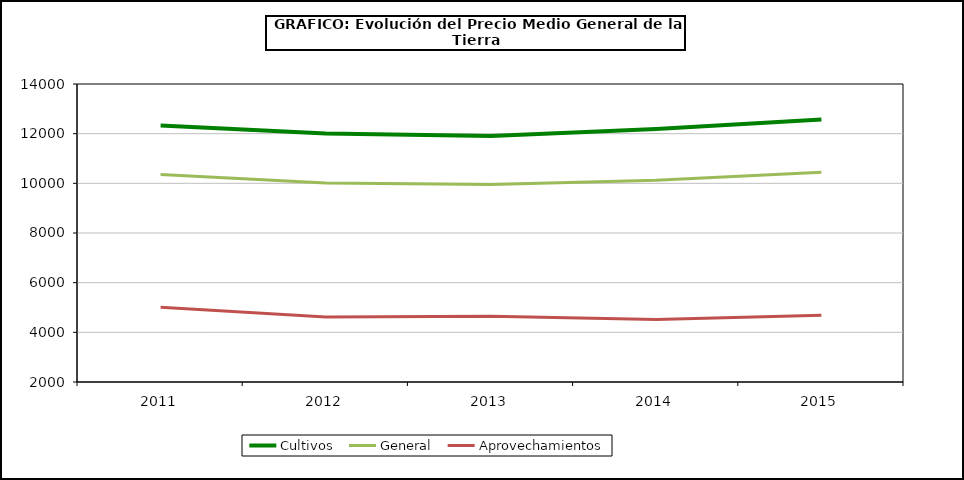
| Category | Cultivos | General | Aprovechamientos |
|---|---|---|---|
| 2011.0 | 12324.98 | 10357.792 | 5014.285 |
| 2012.0 | 12005.431 | 10016.851 | 4615.238 |
| 2013.0 | 11910.019 | 9954.811 | 4643.846 |
| 2014.0 | 12192.232 | 10126.573 | 4515.587 |
| 2015.0 | 12574.317 | 10451.228 | 4684.247 |